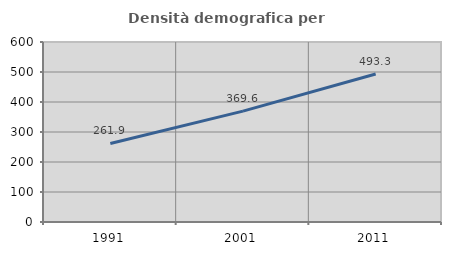
| Category | Densità demografica |
|---|---|
| 1991.0 | 261.93 |
| 2001.0 | 369.644 |
| 2011.0 | 493.333 |